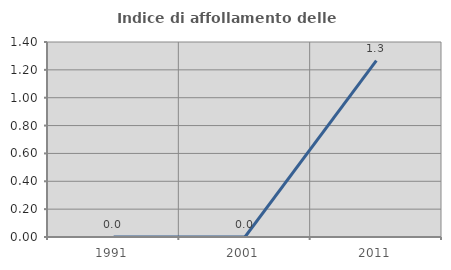
| Category | Indice di affollamento delle abitazioni  |
|---|---|
| 1991.0 | 0 |
| 2001.0 | 0 |
| 2011.0 | 1.266 |